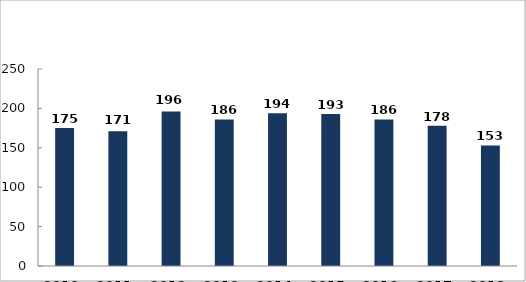
| Category | Súlyosan sérült személyek száma (fő) |
|---|---|
| 2010. év | 175 |
| 2011. év | 171 |
| 2012. év | 196 |
| 2013. év | 186 |
| 2014. év | 194 |
| 2015. év | 193 |
| 2016. év | 186 |
| 2017. év | 178 |
| 2018. év | 153 |